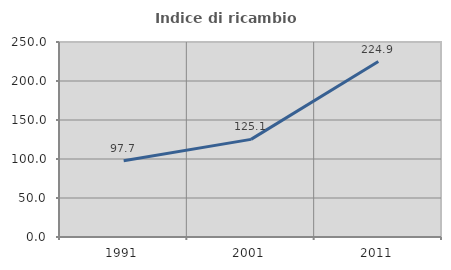
| Category | Indice di ricambio occupazionale  |
|---|---|
| 1991.0 | 97.704 |
| 2001.0 | 125.134 |
| 2011.0 | 224.913 |